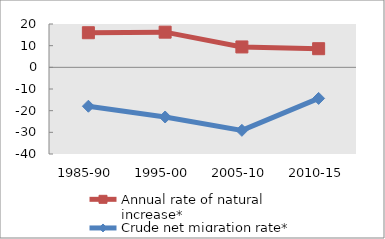
| Category | Annual rate of natural increase* | Crude net migration rate* |
|---|---|---|
| 1985-90 | 15.975 | -17.954 |
| 1995-00 | 16.23 | -22.923 |
| 2005-10 | 9.41 | -29.08 |
| 2010-15 | 8.605 | -14.34 |